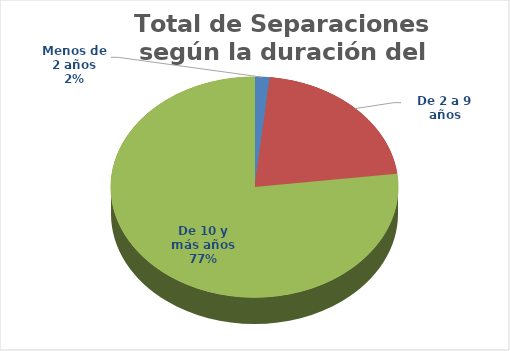
| Category | Series 0 |
|---|---|
| Menos de 2 años | 54 |
| De 2 a 9 años | 686 |
| De 10 y más años | 2470 |